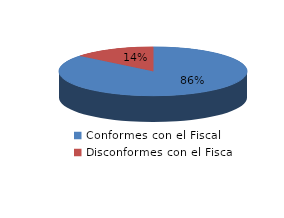
| Category | Series 0 |
|---|---|
| 0 | 73 |
| 1 | 12 |